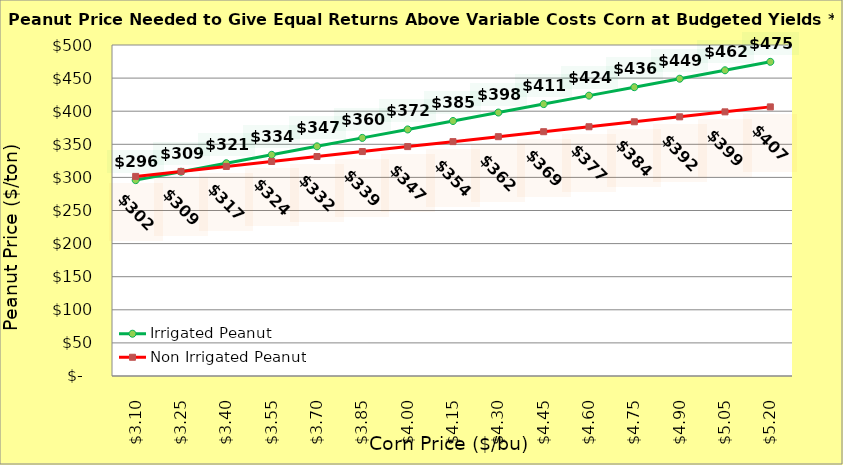
| Category | Irrigated Peanut | Non Irrigated Peanut |
|---|---|---|
| 3.1000000000000005 | 295.847 | 301.521 |
| 3.2500000000000004 | 308.613 | 309.021 |
| 3.4000000000000004 | 321.379 | 316.521 |
| 3.5500000000000003 | 334.145 | 324.021 |
| 3.7 | 346.911 | 331.521 |
| 3.85 | 359.677 | 339.021 |
| 4.0 | 372.443 | 346.521 |
| 4.15 | 385.209 | 354.021 |
| 4.300000000000001 | 397.975 | 361.521 |
| 4.450000000000001 | 410.741 | 369.021 |
| 4.600000000000001 | 423.507 | 376.521 |
| 4.750000000000002 | 436.273 | 384.021 |
| 4.900000000000002 | 449.039 | 391.521 |
| 5.0500000000000025 | 461.805 | 399.021 |
| 5.200000000000003 | 474.571 | 406.521 |